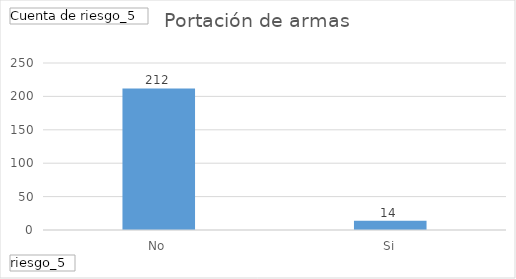
| Category | Total |
|---|---|
| No | 212 |
| Si | 14 |